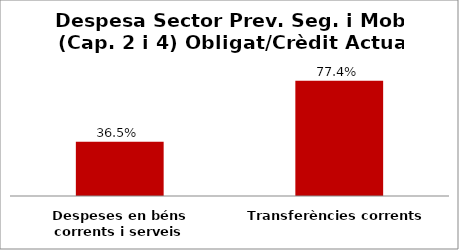
| Category | Series 0 |
|---|---|
| Despeses en béns corrents i serveis | 0.365 |
| Transferències corrents | 0.774 |